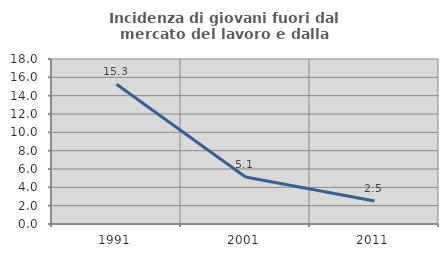
| Category | Incidenza di giovani fuori dal mercato del lavoro e dalla formazione  |
|---|---|
| 1991.0 | 15.254 |
| 2001.0 | 5.128 |
| 2011.0 | 2.5 |